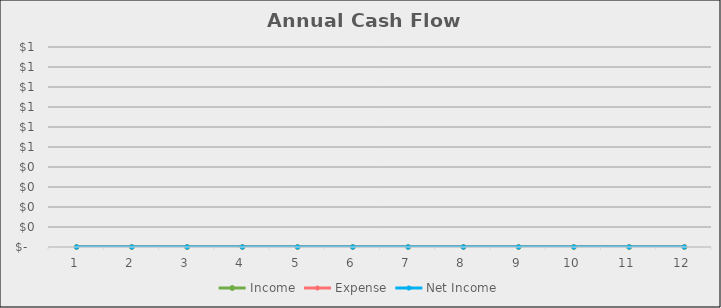
| Category | Income | Expense | Net Income |
|---|---|---|---|
| 0 | 0 | 0 | 0 |
| 1 | 0 | 0 | 0 |
| 2 | 0 | 0 | 0 |
| 3 | 0 | 0 | 0 |
| 4 | 0 | 0 | 0 |
| 5 | 0 | 0 | 0 |
| 6 | 0 | 0 | 0 |
| 7 | 0 | 0 | 0 |
| 8 | 0 | 0 | 0 |
| 9 | 0 | 0 | 0 |
| 10 | 0 | 0 | 0 |
| 11 | 0 | 0 | 0 |